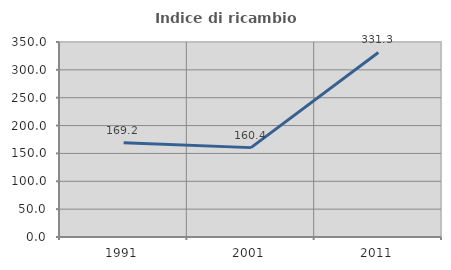
| Category | Indice di ricambio occupazionale  |
|---|---|
| 1991.0 | 169.231 |
| 2001.0 | 160.417 |
| 2011.0 | 331.25 |